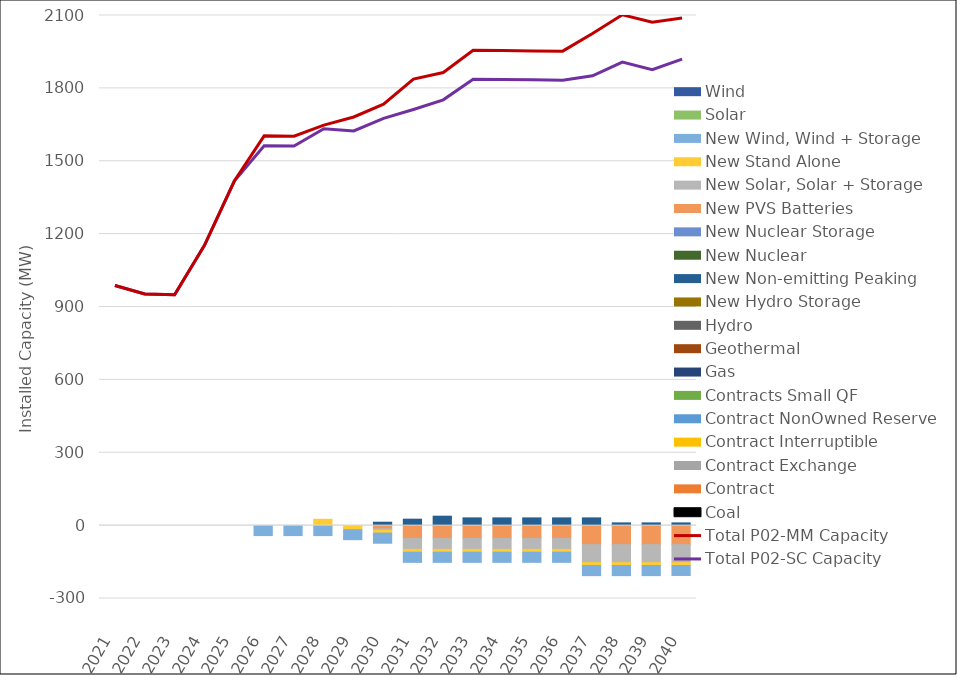
| Category | Coal | Contract | Contract Exchange | Contract Interruptible | Contract NonOwned Reserve | Contracts Small QF | Gas | Geothermal | Hydro | New Hydro Storage | New Non-emitting Peaking | New Nuclear | New Nuclear Storage | New PVS Batteries | New Solar, Solar + Storage | New Stand Alone | New Wind, Wind + Storage | Solar | Wind |
|---|---|---|---|---|---|---|---|---|---|---|---|---|---|---|---|---|---|---|---|
| 2021.0 | 0 | 0 | 0 | 0 | 0 | 0 | 0 | 0 | 0 | 0 | 0 | 0 | 0 | 0 | 0 | 0 | 0 | 0 | 0 |
| 2022.0 | 0 | 0 | 0 | 0 | 0 | 0 | 0 | 0 | 0 | 0 | 0 | 0 | 0 | 0 | 0 | 0 | 0 | 0 | 0 |
| 2023.0 | 0 | 0 | 0 | 0 | 0 | 0 | 0 | 0 | 0 | 0 | 0 | 0 | 0 | 0 | 0 | 0 | 0 | 0 | 0 |
| 2024.0 | 0 | 0 | 0 | 0 | 0 | 0 | 0 | 0 | 0 | 0 | 0 | 0 | 0 | 0 | 0 | 0 | 0 | 0 | 0 |
| 2025.0 | 0 | 0 | 0 | 0 | 0 | 0 | 0 | 0 | 0 | 0 | 0 | 0 | 0 | 0 | 0 | 0 | 0 | 0 | 0 |
| 2026.0 | 0 | 0 | 0 | 0 | 0 | 0 | 0 | 0 | 0 | 0 | 0 | 0 | 0 | 0 | 0 | 0 | -41.033 | 0 | 0 |
| 2027.0 | 0 | 0 | 0 | 0 | 0 | 0 | 0 | 0 | 0 | 0 | 0 | 0 | 0 | 0 | 0 | 0 | -41.033 | 0 | 0 |
| 2028.0 | 0 | 0 | 0 | 0 | 0 | 0 | 0 | 0 | 0 | 0 | 0 | 0 | 0 | 0 | 0 | 26.108 | -41.033 | 0 | 0 |
| 2029.0 | 0 | 0 | 0 | 0 | 0 | 0 | 0 | 0 | 0 | 0 | 0 | 0 | 0 | 0 | 0 | -16.758 | -41.033 | 0 | 0 |
| 2030.0 | 0 | 0 | 0 | 0 | 0 | 0 | 0 | 0 | 0 | 0 | 14.113 | 0 | 0 | -13.003 | -6.155 | -11.553 | -41.855 | 0 | 0 |
| 2031.0 | 0 | 0 | 0 | 0 | 0 | 0 | 0 | 0 | 0 | 0 | 26.521 | 0 | 0 | -52.332 | -45.484 | -11.553 | -41.855 | 0 | 0 |
| 2032.0 | 0 | 0 | 0 | 0 | 0 | 0 | 0 | 0 | 0 | 0 | 38.828 | 0 | 0 | -52.332 | -45.484 | -11.553 | -41.855 | 0 | 0 |
| 2033.0 | 0 | 0 | 0 | 0 | 0 | 0 | 0 | 0 | 0 | 0 | 31.858 | 0 | 0 | -52.332 | -45.484 | -11.553 | -41.855 | 0 | 0 |
| 2034.0 | 0 | 0 | 0 | 0 | 0 | 0 | 0 | 0 | 0 | 0 | 31.858 | 0 | 0 | -52.332 | -45.484 | -11.553 | -41.855 | 0 | 0 |
| 2035.0 | 0 | 0 | 0 | 0 | 0 | 0 | 0 | 0 | 0 | 0 | 31.858 | 0 | 0 | -52.332 | -45.484 | -11.553 | -41.855 | 0 | 0 |
| 2036.0 | 0 | 0 | 0 | 0 | 0 | 0 | 0 | 0 | 0 | 0 | 31.858 | 0 | 0 | -52.332 | -45.484 | -11.553 | -41.855 | 0 | 0 |
| 2037.0 | 0 | 0 | 0 | 0 | 0 | 0 | 0 | 0 | 0 | 0 | 31.858 | 0 | 0 | -78.242 | -74.249 | -11.553 | -41.855 | 0 | 0 |
| 2038.0 | 0 | 0 | 0 | 0 | 0 | 0 | 0 | 0 | 0 | 0 | 11.253 | 0 | 0 | -78.242 | -74.249 | -11.553 | -41.855 | 0 | 0 |
| 2039.0 | 0 | 0 | 0 | 0 | 0 | 0 | 0 | 0 | 0 | 0 | 11.253 | 0 | 0 | -78.242 | -74.249 | -11.553 | -41.855 | 0 | 0 |
| 2040.0 | 0 | 0 | 0 | 0 | 0 | 0 | 0 | 0 | 0 | 0 | 11.253 | 0 | 0 | -78.242 | -74.249 | -11.553 | -41.156 | 0 | 0 |